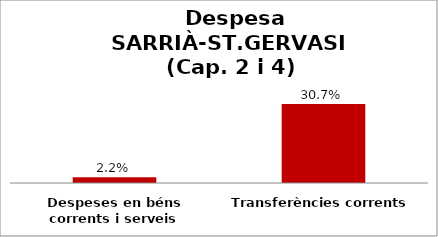
| Category | Series 0 |
|---|---|
| Despeses en béns corrents i serveis | 0.022 |
| Transferències corrents | 0.307 |